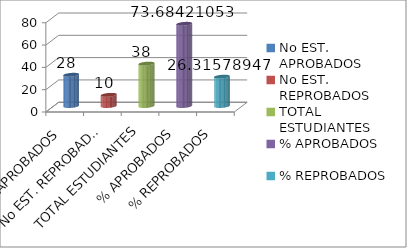
| Category | Series 0 |
|---|---|
| No EST. APROBADOS | 28 |
| No EST. REPROBADOS | 10 |
| TOTAL ESTUDIANTES | 38 |
| % APROBADOS | 73.684 |
| % REPROBADOS | 26.316 |